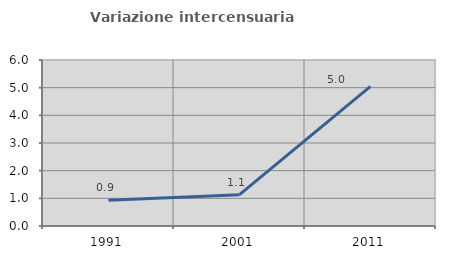
| Category | Variazione intercensuaria annua |
|---|---|
| 1991.0 | 0.926 |
| 2001.0 | 1.133 |
| 2011.0 | 5.047 |